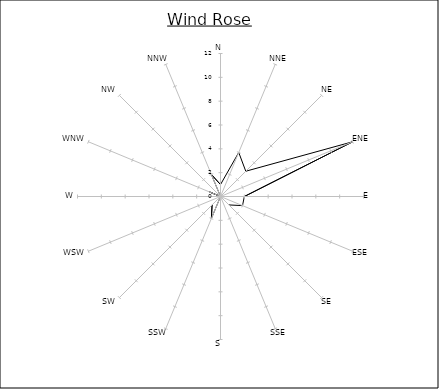
| Category | Series 0 |
|---|---|
| N | 1 |
| NNE | 4 |
| NE | 3 |
| ENE | 12 |
| E | 2 |
| ESE | 2 |
| SE | 1 |
| SSE | 0 |
| S | 0 |
| SSW | 2 |
| SW | 1 |
| WSW | 0 |
| W | 0 |
| WNW | 1 |
| NW | 0 |
| NNW | 2 |